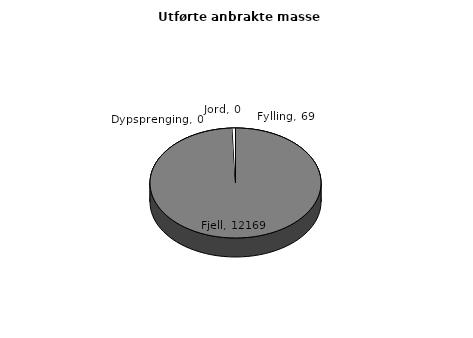
| Category | Jord |
|---|---|
| Jord | 0 |
| Fjell | 12169.33 |
| Dypsprenging | 0 |
| Fylling | 68.525 |